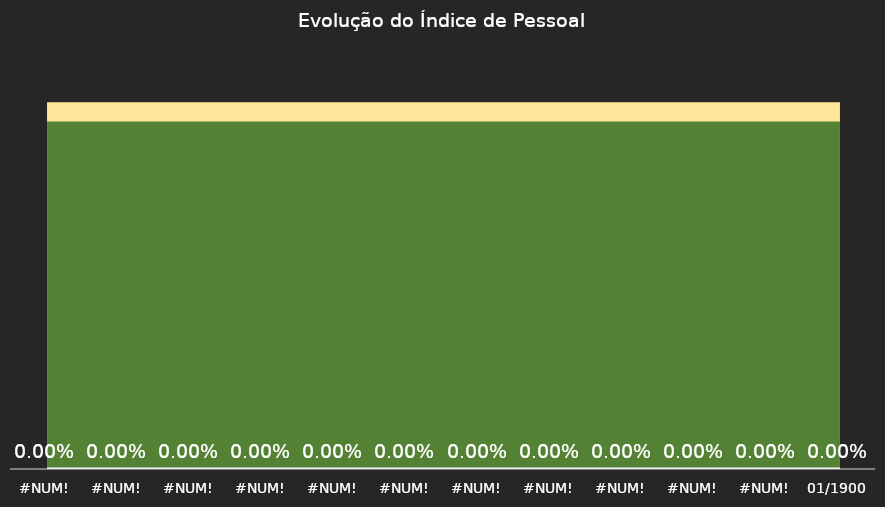
| Category | Índice de pessoal |
|---|---|
| 0.0 | 0 |
| 0.0 | 0 |
| 0.0 | 0 |
| 0.0 | 0 |
| 0.0 | 0 |
| 0.0 | 0 |
| 0.0 | 0 |
| 0.0 | 0 |
| 0.0 | 0 |
| 0.0 | 0 |
| 0.0 | 0 |
| 0.0 | 0 |